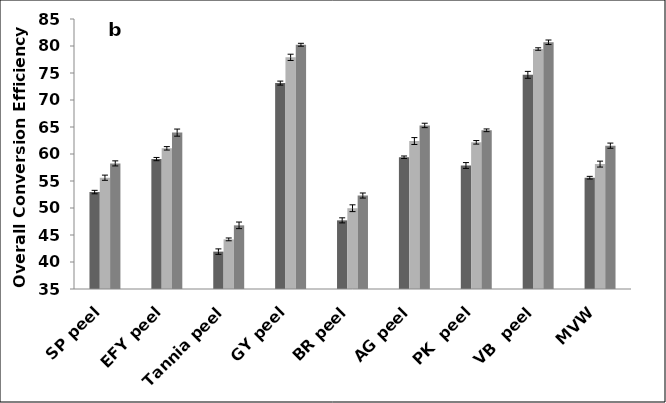
| Category | LRT  24 h | LRT  48 h | LHT  60 min. |
|---|---|---|---|
| SP peel | 52.95 | 55.61 | 58.26 |
| EFY peel | 59.06 | 61.05 | 63.96 |
| Tannia peel | 41.92 | 44.19 | 46.79 |
| GY peel | 73.13 | 77.9 | 80.23 |
| BR peel | 47.71 | 49.96 | 52.31 |
| AG peel | 59.4 | 62.4 | 65.29 |
| PK  peel | 57.87 | 62.16 | 64.39 |
| VB  peel | 74.66 | 79.44 | 80.69 |
| MVW | 55.61 | 58.13 | 61.54 |